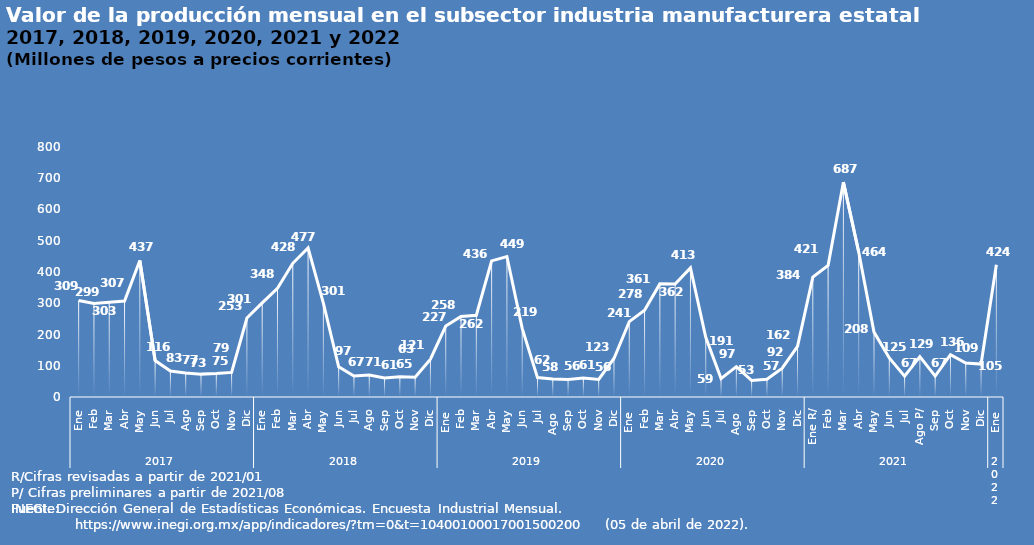
| Category | Manufactura |
|---|---|
| 0 | 309.015 |
| 1 | 299.242 |
| 2 | 302.829 |
| 3 | 307.12 |
| 4 | 436.898 |
| 5 | 116.495 |
| 6 | 82.978 |
| 7 | 77.083 |
| 8 | 73.205 |
| 9 | 74.9 |
| 10 | 78.76 |
| 11 | 252.819 |
| 12 | 301.063 |
| 13 | 347.796 |
| 14 | 427.81 |
| 15 | 476.945 |
| 16 | 300.636 |
| 17 | 96.657 |
| 18 | 67.452 |
| 19 | 70.623 |
| 20 | 61.176 |
| 21 | 64.533 |
| 22 | 63.409 |
| 23 | 121.021 |
| 24 | 227.018 |
| 25 | 257.917 |
| 26 | 261.505 |
| 27 | 435.565 |
| 28 | 449.474 |
| 29 | 219.452 |
| 30 | 62.087 |
| 31 | 57.576 |
| 32 | 56.139 |
| 33 | 60.774 |
| 34 | 55.992 |
| 35 | 123.329 |
| 36 | 241.272 |
| 37 | 277.508 |
| 38 | 361.969 |
| 39 | 361.349 |
| 40 | 413.042 |
| 41 | 190.831 |
| 42 | 58.901 |
| 43 | 97.238 |
| 44 | 52.6 |
| 45 | 56.562 |
| 46 | 92.089 |
| 47 | 161.874 |
| 48 | 383.523 |
| 49 | 421.258 |
| 50 | 687.432 |
| 51 | 463.874 |
| 52 | 207.691 |
| 53 | 124.952 |
| 54 | 66.735 |
| 55 | 129.188 |
| 56 | 67.005 |
| 57 | 135.691 |
| 58 | 108.669 |
| 59 | 105.474 |
| 60 | 423.515 |